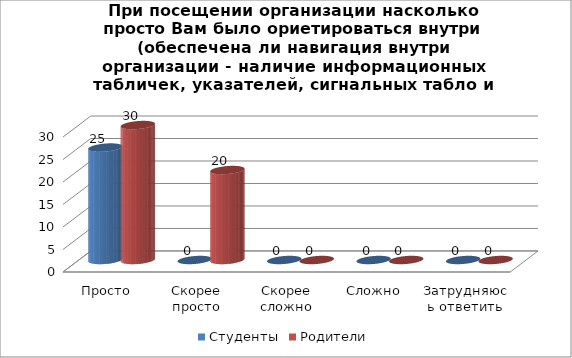
| Category | Студенты | Родители |
|---|---|---|
| Просто | 25 | 30 |
| Скорее просто | 0 | 20 |
| Скорее сложно | 0 | 0 |
| Сложно | 0 | 0 |
| Затрудняюсь ответить | 0 | 0 |